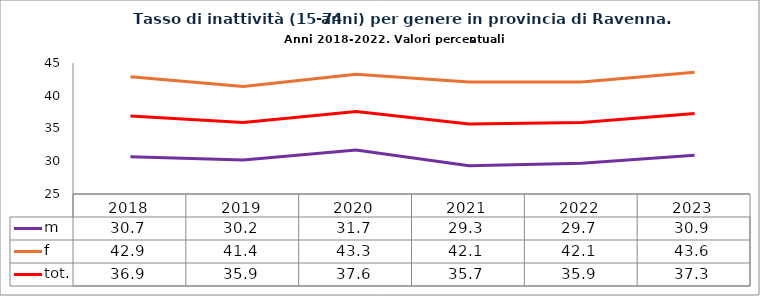
| Category | m | f | tot. |
|---|---|---|---|
| 2018.0 | 30.7 | 42.9 | 36.9 |
| 2019.0 | 30.2 | 41.4 | 35.9 |
| 2020.0 | 31.7 | 43.3 | 37.6 |
| 2021.0 | 29.3 | 42.1 | 35.7 |
| 2022.0 | 29.7 | 42.1 | 35.9 |
| 2023.0 | 30.9 | 43.6 | 37.3 |